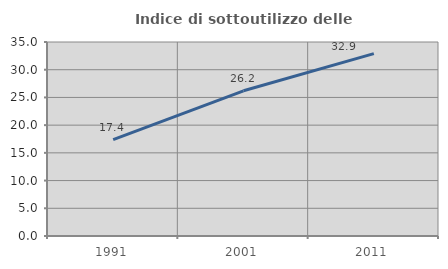
| Category | Indice di sottoutilizzo delle abitazioni  |
|---|---|
| 1991.0 | 17.376 |
| 2001.0 | 26.198 |
| 2011.0 | 32.903 |